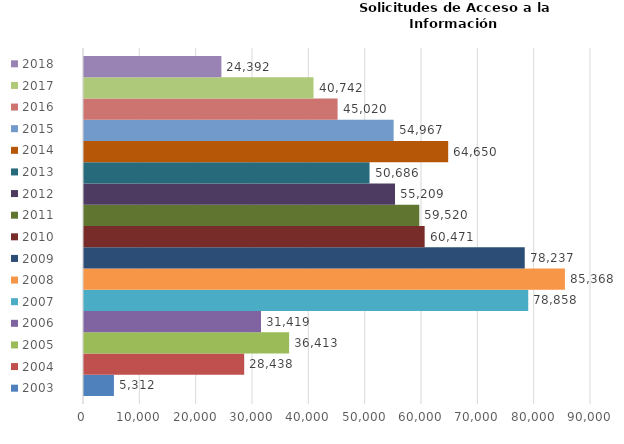
| Category | 2003 | 2004 | 2005 | 2006 | 2007 | 2008 | 2009 | 2010 | 2011 | 2012 | 2013 | 2014 | 2015 | 2016 | 2017 | 2018 |
|---|---|---|---|---|---|---|---|---|---|---|---|---|---|---|---|---|
| 0 | 5312 | 28438 | 36413 | 31419 | 78858 | 85368 | 78237 | 60471 | 59520 | 55209 | 50686 | 64650 | 54967 | 45020 | 40742 | 24392 |